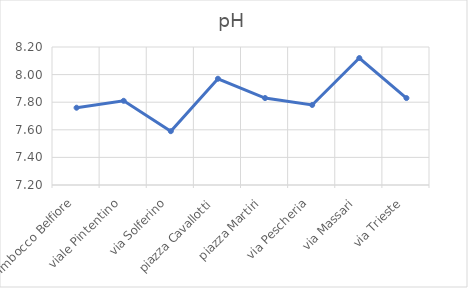
| Category |  pH |
|---|---|
| Imbocco Belfiore | 7.76 |
| viale Pintentino | 7.81 |
| via Solferino | 7.59 |
| piazza Cavallotti | 7.97 |
| piazza Martiri | 7.83 |
| via Pescheria | 7.78 |
| via Massari | 8.12 |
| via Trieste | 7.83 |